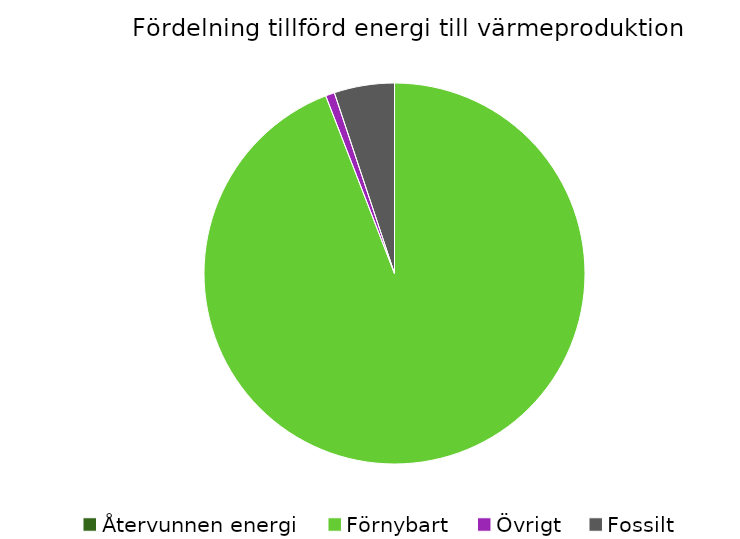
| Category | Fördelning värmeproduktion |
|---|---|
| Återvunnen energi | 0 |
| Förnybart | 0.941 |
| Övrigt | 0.008 |
| Fossilt | 0.051 |